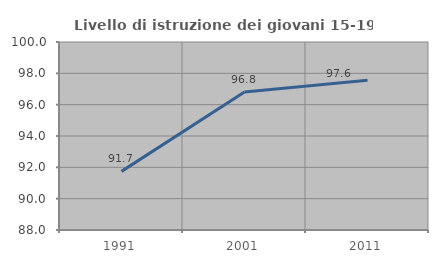
| Category | Livello di istruzione dei giovani 15-19 anni |
|---|---|
| 1991.0 | 91.742 |
| 2001.0 | 96.809 |
| 2011.0 | 97.556 |